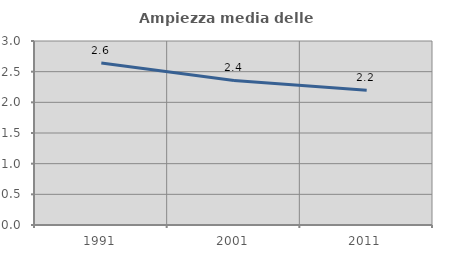
| Category | Ampiezza media delle famiglie |
|---|---|
| 1991.0 | 2.641 |
| 2001.0 | 2.357 |
| 2011.0 | 2.198 |